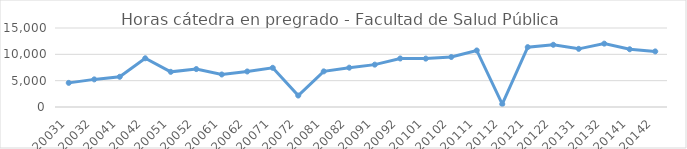
| Category | Total horas |
|---|---|
| 20031 | 4583 |
| 20032 | 5243 |
| 20041 | 5739 |
| 20042 | 9249 |
| 20051 | 6677 |
| 20052 | 7202 |
| 20061 | 6174 |
| 20062 | 6746 |
| 20071 | 7440 |
| 20072 | 2175 |
| 20081 | 6764 |
| 20082 | 7467 |
| 20091 | 8043 |
| 20092 | 9213 |
| 20101 | 9187 |
| 20102 | 9493 |
| 20111 | 10732 |
| 20112 | 552 |
| 20121 | 11366 |
| 20122 | 11812 |
| 20131 | 11041 |
| 20132 | 12029 |
| 20141 | 10964 |
| 20142 | 10554 |